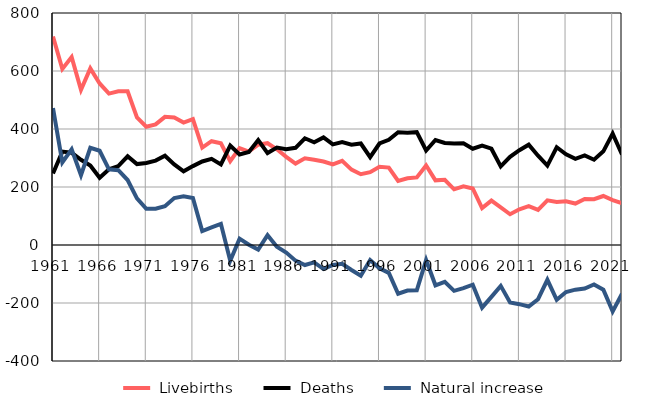
| Category |  Livebirths |  Deaths |  Natural increase |
|---|---|---|---|
| 1961.0 | 719 | 247 | 472 |
| 1962.0 | 607 | 322 | 285 |
| 1963.0 | 648 | 318 | 330 |
| 1964.0 | 535 | 294 | 241 |
| 1965.0 | 609 | 274 | 335 |
| 1966.0 | 557 | 232 | 325 |
| 1967.0 | 522 | 261 | 261 |
| 1968.0 | 530 | 272 | 258 |
| 1969.0 | 530 | 306 | 224 |
| 1970.0 | 440 | 279 | 161 |
| 1971.0 | 408 | 283 | 125 |
| 1972.0 | 416 | 291 | 125 |
| 1973.0 | 442 | 308 | 134 |
| 1974.0 | 440 | 278 | 162 |
| 1975.0 | 422 | 254 | 168 |
| 1976.0 | 434 | 272 | 162 |
| 1977.0 | 336 | 288 | 48 |
| 1978.0 | 358 | 297 | 61 |
| 1979.0 | 351 | 278 | 73 |
| 1980.0 | 289 | 343 | -54 |
| 1981.0 | 334 | 312 | 22 |
| 1982.0 | 322 | 321 | 1 |
| 1983.0 | 346 | 362 | -16 |
| 1984.0 | 351 | 317 | 34 |
| 1985.0 | 330 | 336 | -6 |
| 1986.0 | 304 | 330 | -26 |
| 1987.0 | 281 | 335 | -54 |
| 1988.0 | 299 | 368 | -69 |
| 1989.0 | 294 | 354 | -60 |
| 1990.0 | 288 | 371 | -83 |
| 1991.0 | 278 | 347 | -69 |
| 1992.0 | 290 | 355 | -65 |
| 1993.0 | 260 | 346 | -86 |
| 1994.0 | 244 | 350 | -106 |
| 1995.0 | 251 | 303 | -52 |
| 1996.0 | 270 | 350 | -80 |
| 1997.0 | 267 | 363 | -96 |
| 1998.0 | 221 | 389 | -168 |
| 1999.0 | 230 | 387 | -157 |
| 2000.0 | 233 | 389 | -156 |
| 2001.0 | 274 | 326 | -52 |
| 2002.0 | 223 | 362 | -139 |
| 2003.0 | 225 | 352 | -127 |
| 2004.0 | 192 | 350 | -158 |
| 2005.0 | 202 | 351 | -149 |
| 2006.0 | 195 | 332 | -137 |
| 2007.0 | 127 | 343 | -216 |
| 2008.0 | 153 | 332 | -179 |
| 2009.0 | 130 | 271 | -141 |
| 2010.0 | 106 | 304 | -198 |
| 2011.0 | 123 | 327 | -204 |
| 2012.0 | 134 | 346 | -212 |
| 2013.0 | 121 | 308 | -187 |
| 2014.0 | 154 | 274 | -120 |
| 2015.0 | 148 | 337 | -189 |
| 2016.0 | 151 | 313 | -162 |
| 2017.0 | 143 | 297 | -154 |
| 2018.0 | 159 | 309 | -150 |
| 2019.0 | 158 | 294 | -136 |
| 2020.0 | 169 | 323 | -154 |
| 2021.0 | 155 | 384 | -229 |
| 2022.0 | 144 | 312 | -168 |